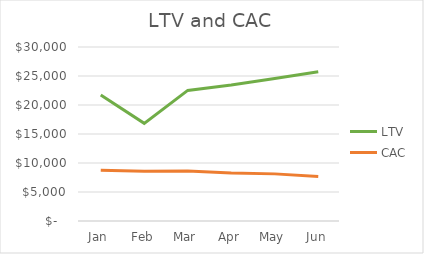
| Category | LTV | CAC |
|---|---|---|
| Jan | 21738.095 | 8750 |
| Feb | 16834.215 | 8571.429 |
| Mar | 22519.38 | 8604.651 |
| Apr | 23456.522 | 8260.87 |
| May | 24572.368 | 8125 |
| Jun | 25715.812 | 7692.308 |